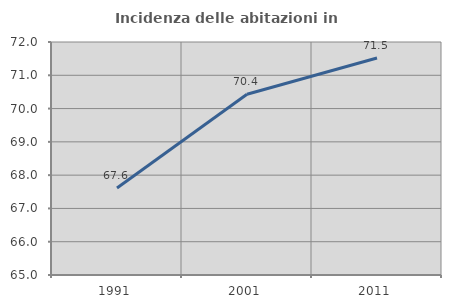
| Category | Incidenza delle abitazioni in proprietà  |
|---|---|
| 1991.0 | 67.612 |
| 2001.0 | 70.429 |
| 2011.0 | 71.517 |